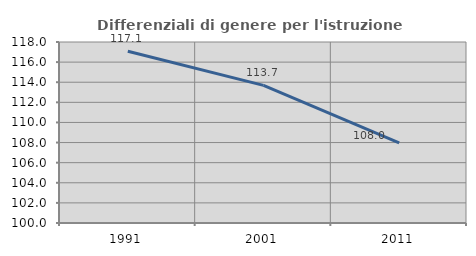
| Category | Differenziali di genere per l'istruzione superiore |
|---|---|
| 1991.0 | 117.074 |
| 2001.0 | 113.691 |
| 2011.0 | 107.973 |